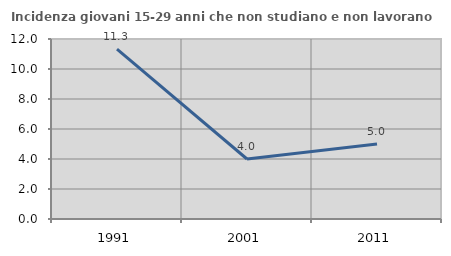
| Category | Incidenza giovani 15-29 anni che non studiano e non lavorano  |
|---|---|
| 1991.0 | 11.323 |
| 2001.0 | 4 |
| 2011.0 | 5 |